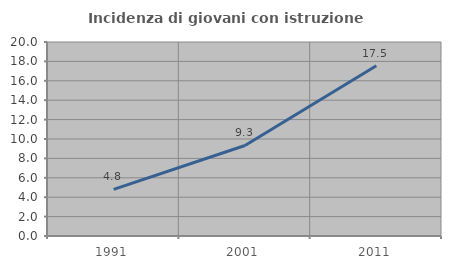
| Category | Incidenza di giovani con istruzione universitaria |
|---|---|
| 1991.0 | 4.8 |
| 2001.0 | 9.333 |
| 2011.0 | 17.544 |